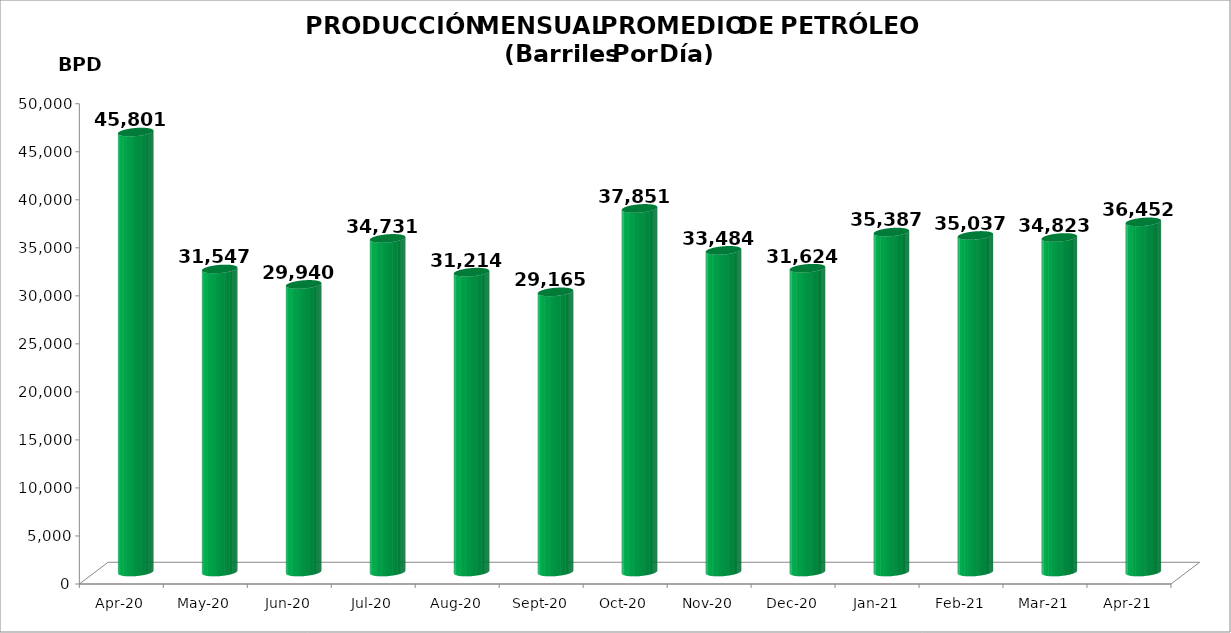
| Category | Series 0 |
|---|---|
| 2020-04-01 | 45801 |
| 2020-05-01 | 31547 |
| 2020-06-01 | 29940 |
| 2020-07-01 | 34731 |
| 2020-08-01 | 31214 |
| 2020-09-01 | 29165 |
| 2020-10-01 | 37851 |
| 2020-11-01 | 33484 |
| 2020-12-01 | 31624 |
| 2021-01-01 | 35387 |
| 2021-02-01 | 35037 |
| 2021-03-01 | 34823 |
| 2021-04-01 | 36452 |